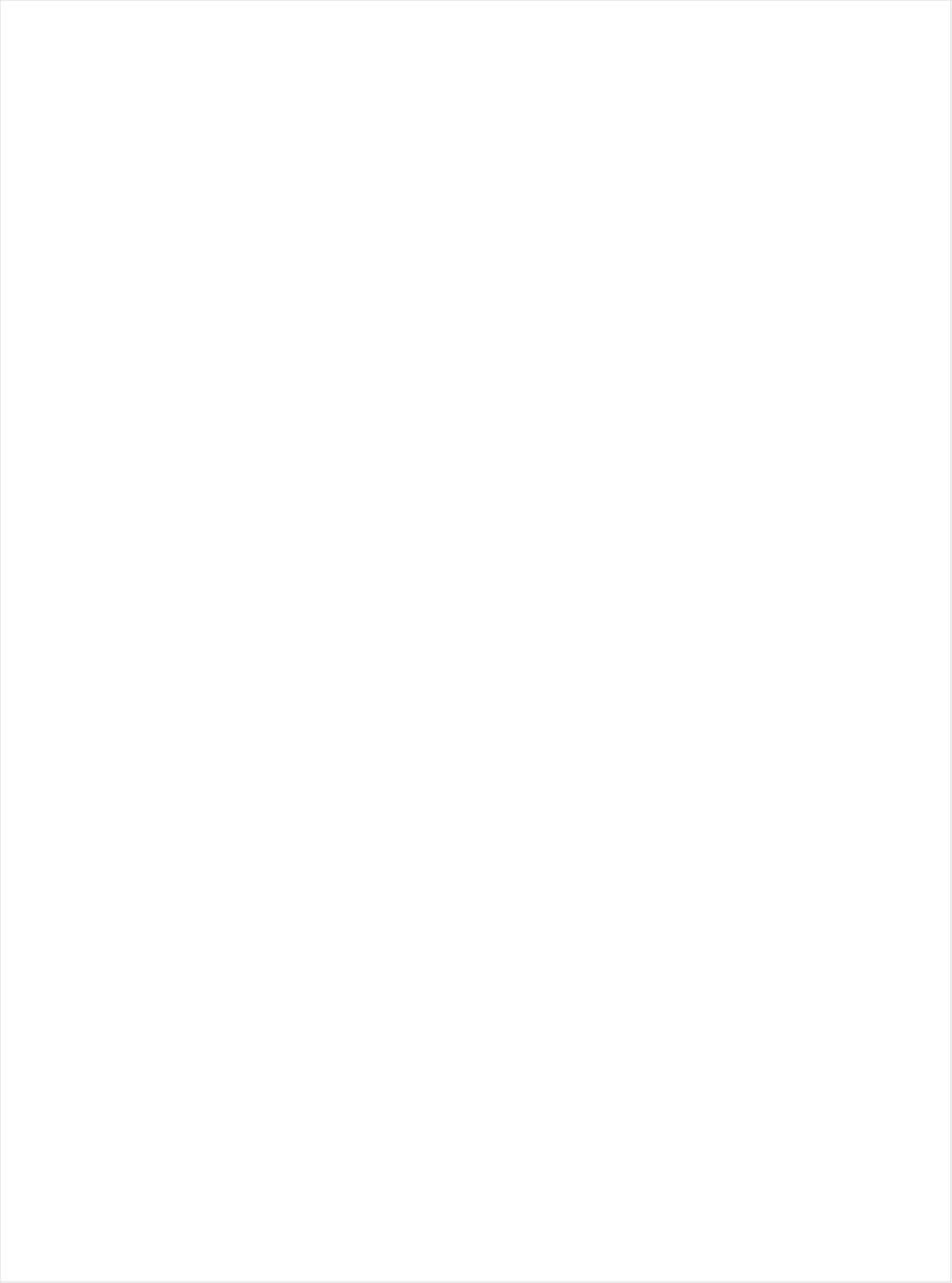
| Category | Total |
|---|---|
| UniMas | -0.671 |
| Telemundo | -0.67 |
| Galavision | -0.664 |
| Univision | -0.631 |
| NBC Universo | -0.606 |
| TUDN | -0.473 |
| Cartoon Network | -0.349 |
| Hallmark Movies & Mysteries | -0.28 |
| Hallmark | -0.225 |
| Logo | -0.202 |
| UP TV | -0.196 |
| Discovery Life Channel | -0.187 |
| Lifetime Movies | -0.16 |
| Nick Toons | -0.157 |
| TLC | -0.139 |
| Disney Channel | -0.127 |
| Nick | -0.104 |
| WE TV | -0.102 |
| Teen Nick | -0.098 |
| Travel | -0.093 |
| INSP | -0.082 |
| Investigation Discovery | -0.08 |
| Oprah Winfrey Network | -0.077 |
| Adult Swim | -0.075 |
| RFD TV | -0.073 |
| CMTV | -0.07 |
| Lifetime | -0.066 |
| OXYGEN | -0.065 |
| Nick@Nite | -0.062 |
| Nick Jr. | -0.049 |
| VH1 | -0.034 |
| ION | -0.026 |
| Disney XD | -0.018 |
| Headline News | -0.016 |
| PBS | -0.01 |
| POP | -0.006 |
| BET | -0.002 |
| E! | 0.007 |
| BRAVO | 0.012 |
| Discovery Family Channel | 0.014 |
| Disney Junior US | 0.016 |
| Great American Country | 0.018 |
| Science Channel | 0.02 |
| TV LAND | 0.022 |
| Universal Kids | 0.023 |
| MSNBC | 0.024 |
| CW | 0.029 |
| National Geographic Wild | 0.037 |
| HGTV | 0.043 |
| Weather Channel | 0.061 |
| Fox Business | 0.061 |
| Freeform | 0.066 |
| Animal Planet | 0.075 |
| TV ONE | 0.082 |
| WGN America | 0.084 |
| BET Her | 0.086 |
| SYFY | 0.087 |
| History Channel | 0.091 |
| Fox News | 0.093 |
| MTV2 | 0.101 |
| USA Network | 0.105 |
| A&E | 0.108 |
| FXX | 0.113 |
| ABC | 0.119 |
| FX Movie Channel | 0.121 |
| MTV | 0.125 |
| CBS | 0.126 |
| Food Network | 0.132 |
| Reelz Channel | 0.133 |
| Motor Trend Network | 0.134 |
| NBC | 0.135 |
| Ovation | 0.137 |
| FYI | 0.137 |
| Discovery Channel | 0.144 |
| CNN | 0.145 |
| FOX | 0.146 |
| BBC America | 0.154 |
| TBS | 0.155 |
| Game Show | 0.155 |
| FX | 0.155 |
| Bloomberg HD | 0.162 |
| SundanceTV | 0.165 |
| FXDEP | 0.167 |
| DIY | 0.173 |
| Paramount Network | 0.184 |
| Smithsonian | 0.188 |
| Destination America | 0.193 |
| American Heroes Channel | 0.194 |
| AMC | 0.197 |
| CNBC | 0.198 |
| Independent Film (IFC) | 0.207 |
| National Geographic | 0.223 |
| TNT | 0.227 |
| truTV | 0.227 |
| Comedy Central | 0.229 |
| Cooking Channel | 0.239 |
| Outdoor Channel | 0.264 |
| Viceland | 0.283 |
| The Sportsman Channel | 0.284 |
| Tennis Channel | 0.302 |
| NBC Sports | 0.33 |
| MyNetworkTV | 0.428 |
| ESPN Deportes | 0.443 |
| FOX Sports 2 | 0.534 |
| Olympic Channel | 0.578 |
| CBS Sports | 0.583 |
| Golf | 0.651 |
| MLB Network | 0.675 |
| Fox Sports 1 | 0.686 |
| NBA TV | 0.714 |
| NHL | 0.716 |
| ESPN2 | 0.722 |
| Big Ten Network | 0.733 |
| ESPNEWS | 0.734 |
| ESPNU | 0.771 |
| ESPN | 0.772 |
| PAC-12 Network | 0.784 |
| NFL Network | 1.056 |